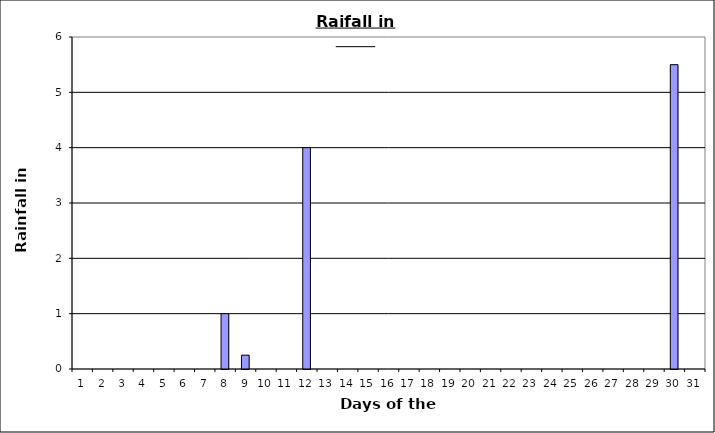
| Category | Series 0 |
|---|---|
| 0 | 0 |
| 1 | 0 |
| 2 | 0 |
| 3 | 0 |
| 4 | 0 |
| 5 | 0 |
| 6 | 0 |
| 7 | 1 |
| 8 | 0.25 |
| 9 | 0 |
| 10 | 0 |
| 11 | 4 |
| 12 | 0 |
| 13 | 0 |
| 14 | 0 |
| 15 | 0 |
| 16 | 0 |
| 17 | 0 |
| 18 | 0 |
| 19 | 0 |
| 20 | 0 |
| 21 | 0 |
| 22 | 0 |
| 23 | 0 |
| 24 | 0 |
| 25 | 0 |
| 26 | 0 |
| 27 | 0 |
| 28 | 0 |
| 29 | 5.5 |
| 30 | 0 |